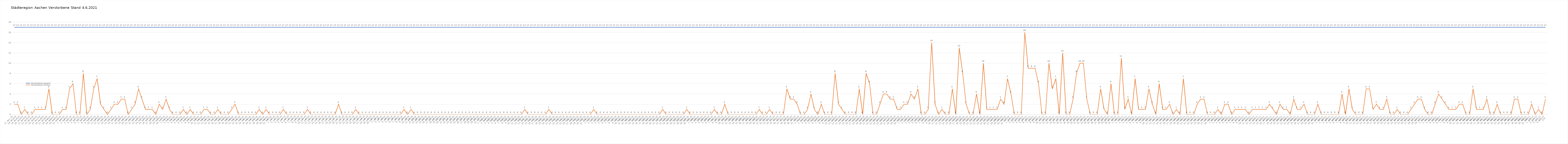
| Category | Verstorbene gesamt | Verstorbene Corona |
|---|---|---|
| 0 | 17 | 2 |
| 1 | 17 | 2 |
| 2 | 17 | 0 |
| 3 | 17 | 1 |
| 4 | 17 | 0 |
| 5 | 17 | 0 |
| 6 | 17 | 1 |
| 7 | 17 | 1 |
| 8 | 17 | 1 |
| 9 | 17 | 1 |
| 10 | 17 | 5 |
| 11 | 17 | 0 |
| 12 | 17 | 0 |
| 13 | 17 | 0 |
| 14 | 17 | 1 |
| 15 | 17 | 1 |
| 16 | 17 | 5 |
| 17 | 17 | 6 |
| 18 | 17 | 0 |
| 19 | 17 | 0 |
| 20 | 17 | 8 |
| 21 | 17 | 0 |
| 22 | 17 | 1 |
| 23 | 17 | 5 |
| 24 | 17 | 7 |
| 25 | 17 | 2 |
| 26 | 17 | 1 |
| 27 | 17 | 0 |
| 28 | 17 | 1 |
| 29 | 17 | 2 |
| 30 | 17 | 2 |
| 31 | 17 | 3 |
| 32 | 17 | 3 |
| 33 | 17 | 0 |
| 34 | 17 | 1 |
| 35 | 17 | 2 |
| 36 | 17 | 5 |
| 37 | 17 | 3 |
| 38 | 17 | 1 |
| 39 | 17 | 1 |
| 40 | 17 | 1 |
| 41 | 17 | 0 |
| 42 | 17 | 2 |
| 43 | 17 | 1 |
| 44 | 17 | 3 |
| 45 | 17 | 1 |
| 46 | 17 | 0 |
| 47 | 17 | 0 |
| 48 | 17 | 0 |
| 49 | 17 | 1 |
| 50 | 17 | 0 |
| 51 | 17 | 1 |
| 52 | 17 | 0 |
| 53 | 17 | 0 |
| 54 | 17 | 0 |
| 55 | 17 | 1 |
| 56 | 17 | 1 |
| 57 | 17 | 0 |
| 58 | 17 | 0 |
| 59 | 17 | 1 |
| 60 | 17 | 0 |
| 61 | 17 | 0 |
| 62 | 17 | 0 |
| 63 | 17 | 1 |
| 64 | 17 | 2 |
| 65 | 17 | 0 |
| 66 | 17 | 0 |
| 67 | 17 | 0 |
| 68 | 17 | 0 |
| 69 | 17 | 0 |
| 70 | 17 | 0 |
| 71 | 17 | 1 |
| 72 | 17 | 0 |
| 73 | 17 | 1 |
| 74 | 17 | 0 |
| 75 | 17 | 0 |
| 76 | 17 | 0 |
| 77 | 17 | 0 |
| 78 | 17 | 1 |
| 79 | 17 | 0 |
| 80 | 17 | 0 |
| 81 | 17 | 0 |
| 82 | 17 | 0 |
| 83 | 17 | 0 |
| 84 | 17 | 0 |
| 85 | 17 | 1 |
| 86 | 17 | 0 |
| 87 | 17 | 0 |
| 88 | 17 | 0 |
| 89 | 17 | 0 |
| 90 | 17 | 0 |
| 91 | 17 | 0 |
| 92 | 17 | 0 |
| 93 | 17 | 0 |
| 94 | 17 | 2 |
| 95 | 17 | 0 |
| 96 | 17 | 0 |
| 97 | 17 | 0 |
| 98 | 17 | 0 |
| 99 | 17 | 1 |
| 100 | 17 | 0 |
| 101 | 17 | 0 |
| 102 | 17 | 0 |
| 103 | 17 | 0 |
| 104 | 17 | 0 |
| 105 | 17 | 0 |
| 106 | 17 | 0 |
| 107 | 17 | 0 |
| 108 | 17 | 0 |
| 109 | 17 | 0 |
| 110 | 17 | 0 |
| 111 | 17 | 0 |
| 112 | 17 | 0 |
| 113 | 17 | 1 |
| 114 | 17 | 0 |
| 115 | 17 | 1 |
| 116 | 17 | 0 |
| 117 | 17 | 0 |
| 118 | 17 | 0 |
| 119 | 17 | 0 |
| 120 | 17 | 0 |
| 121 | 17 | 0 |
| 122 | 17 | 0 |
| 123 | 17 | 0 |
| 124 | 17 | 0 |
| 125 | 17 | 0 |
| 126 | 17 | 0 |
| 127 | 17 | 0 |
| 128 | 17 | 0 |
| 129 | 17 | 0 |
| 130 | 17 | 0 |
| 131 | 17 | 0 |
| 132 | 17 | 0 |
| 133 | 17 | 0 |
| 134 | 17 | 0 |
| 135 | 17 | 0 |
| 136 | 17 | 0 |
| 137 | 17 | 0 |
| 138 | 17 | 0 |
| 139 | 17 | 0 |
| 140 | 17 | 0 |
| 141 | 17 | 0 |
| 142 | 17 | 0 |
| 143 | 17 | 0 |
| 144 | 17 | 0 |
| 145 | 17 | 0 |
| 146 | 17 | 0 |
| 147 | 17 | 0 |
| 148 | 17 | 1 |
| 149 | 17 | 0 |
| 150 | 17 | 0 |
| 151 | 17 | 0 |
| 152 | 17 | 0 |
| 153 | 17 | 0 |
| 154 | 17 | 0 |
| 155 | 17 | 1 |
| 156 | 17 | 0 |
| 157 | 17 | 0 |
| 158 | 17 | 0 |
| 159 | 17 | 0 |
| 160 | 17 | 0 |
| 161 | 17 | 0 |
| 162 | 17 | 0 |
| 163 | 17 | 0 |
| 164 | 17 | 0 |
| 165 | 17 | 0 |
| 166 | 17 | 0 |
| 167 | 17 | 0 |
| 168 | 17 | 1 |
| 169 | 17 | 0 |
| 170 | 17 | 0 |
| 171 | 17 | 0 |
| 172 | 17 | 0 |
| 173 | 17 | 0 |
| 174 | 17 | 0 |
| 175 | 17 | 0 |
| 176 | 17 | 0 |
| 177 | 17 | 0 |
| 178 | 17 | 0 |
| 179 | 17 | 0 |
| 180 | 17 | 0 |
| 181 | 17 | 0 |
| 182 | 17 | 0 |
| 183 | 17 | 0 |
| 184 | 17 | 0 |
| 185 | 17 | 0 |
| 186 | 17 | 0 |
| 187 | 17 | 0 |
| 188 | 17 | 1 |
| 189 | 17 | 0 |
| 190 | 17 | 0 |
| 191 | 17 | 0 |
| 192 | 17 | 0 |
| 193 | 17 | 0 |
| 194 | 17 | 0 |
| 195 | 17 | 1 |
| 196 | 17 | 0 |
| 197 | 17 | 0 |
| 198 | 17 | 0 |
| 199 | 17 | 0 |
| 200 | 17 | 0 |
| 201 | 17 | 0 |
| 202 | 17 | 0 |
| 203 | 17 | 1 |
| 204 | 17 | 0 |
| 205 | 17 | 0 |
| 206 | 17 | 2 |
| 207 | 17 | 0 |
| 208 | 17 | 0 |
| 209 | 17 | 0 |
| 210 | 17 | 0 |
| 211 | 17 | 0 |
| 212 | 17 | 0 |
| 213 | 17 | 0 |
| 214 | 17 | 0 |
| 215 | 17 | 0 |
| 216 | 17 | 1 |
| 217 | 17 | 0 |
| 218 | 17 | 0 |
| 219 | 17 | 1 |
| 220 | 17 | 0 |
| 221 | 17 | 0 |
| 222 | 17 | 0 |
| 223 | 17 | 0 |
| 224 | 17 | 5 |
| 225 | 17 | 3 |
| 226 | 17 | 3 |
| 227 | 17 | 2 |
| 228 | 17 | 0 |
| 229 | 17 | 0 |
| 230 | 17 | 1 |
| 231 | 17 | 4 |
| 232 | 17 | 1 |
| 233 | 17 | 0 |
| 234 | 17 | 2 |
| 235 | 17 | 0 |
| 236 | 17 | 0 |
| 237 | 17 | 0 |
| 238 | 17 | 8 |
| 239 | 17 | 2 |
| 240 | 17 | 1 |
| 241 | 17 | 0 |
| 242 | 17 | 0 |
| 243 | 17 | 0 |
| 244 | 17 | 0 |
| 245 | 17 | 5 |
| 246 | 17 | 0 |
| 247 | 17 | 8 |
| 248 | 17 | 6 |
| 249 | 17 | 0 |
| 250 | 17 | 0 |
| 251 | 17 | 2 |
| 252 | 17 | 4 |
| 253 | 17 | 4 |
| 254 | 17 | 3 |
| 255 | 17 | 3 |
| 256 | 17 | 1 |
| 257 | 17 | 1 |
| 258 | 17 | 2 |
| 259 | 17 | 2 |
| 260 | 17 | 4 |
| 261 | 17 | 3 |
| 262 | 17 | 5 |
| 263 | 17 | 0 |
| 264 | 17 | 0 |
| 265 | 17 | 1 |
| 266 | 17 | 14 |
| 267 | 17 | 2 |
| 268 | 17 | 0 |
| 269 | 17 | 1 |
| 270 | 17 | 0 |
| 271 | 17 | 0 |
| 272 | 17 | 5 |
| 273 | 17 | 0 |
| 274 | 17 | 13 |
| 275 | 17 | 8 |
| 276 | 17 | 2 |
| 277 | 17 | 0 |
| 278 | 17 | 0 |
| 279 | 17 | 4 |
| 280 | 17 | 0 |
| 281 | 17 | 10 |
| 282 | 17 | 1 |
| 283 | 17 | 1 |
| 284 | 17 | 1 |
| 285 | 17 | 1 |
| 286 | 17 | 3 |
| 287 | 17 | 2 |
| 288 | 17 | 7 |
| 289 | 17 | 4 |
| 290 | 17 | 0 |
| 291 | 17 | 0 |
| 292 | 17 | 0 |
| 293 | 17 | 16 |
| 294 | 17 | 9 |
| 295 | 17 | 9 |
| 296 | 17 | 9 |
| 297 | 17 | 6 |
| 298 | 17 | 0 |
| 299 | 17 | 0 |
| 300 | 17 | 10 |
| 301 | 17 | 5 |
| 302 | 17 | 7 |
| 303 | 17 | 0 |
| 304 | 17 | 12 |
| 305 | 17 | 0 |
| 306 | 17 | 0 |
| 307 | 17 | 3 |
| 308 | 17 | 8 |
| 309 | 17 | 10 |
| 310 | 17 | 10 |
| 311 | 17 | 3 |
| 312 | 17 | 0 |
| 313 | 17 | 0 |
| 314 | 17 | 0 |
| 315 | 17 | 5 |
| 316 | 17 | 1 |
| 317 | 17 | 0 |
| 318 | 17 | 6 |
| 319 | 17 | 0 |
| 320 | 17 | 0 |
| 321 | 17 | 11 |
| 322 | 17 | 1 |
| 323 | 17 | 3 |
| 324 | 17 | 0 |
| 325 | 17 | 7 |
| 326 | 17 | 1 |
| 327 | 17 | 1 |
| 328 | 17 | 1 |
| 329 | 17 | 5 |
| 330 | 17 | 2 |
| 331 | 17 | 0 |
| 332 | 17 | 6 |
| 333 | 17 | 1 |
| 334 | 17 | 1 |
| 335 | 17 | 2 |
| 336 | 17 | 0 |
| 337 | 17 | 1 |
| 338 | 17 | 0 |
| 339 | 17 | 7 |
| 340 | 17 | 0 |
| 341 | 17 | 0 |
| 342 | 17 | 0 |
| 343 | 17 | 2 |
| 344 | 17 | 3 |
| 345 | 17 | 3 |
| 346 | 17 | 0 |
| 347 | 17 | 0 |
| 348 | 17 | 0 |
| 349 | 17 | 1 |
| 350 | 17 | 0 |
| 351 | 17 | 2 |
| 352 | 17 | 2 |
| 353 | 17 | 0 |
| 354 | 17 | 1 |
| 355 | 17 | 1 |
| 356 | 17 | 1 |
| 357 | 17 | 1 |
| 358 | 17 | 0 |
| 359 | 17 | 1 |
| 360 | 17 | 1 |
| 361 | 17 | 1 |
| 362 | 17 | 1 |
| 363 | 17 | 1 |
| 364 | 17 | 2 |
| 365 | 17 | 1 |
| 366 | 17 | 0 |
| 367 | 17 | 2 |
| 368 | 17 | 1 |
| 369 | 17 | 1 |
| 370 | 17 | 0 |
| 371 | 17 | 3 |
| 372 | 17 | 1 |
| 373 | 17 | 1 |
| 374 | 17 | 2 |
| 375 | 17 | 0 |
| 376 | 17 | 0 |
| 377 | 17 | 0 |
| 378 | 17 | 2 |
| 379 | 17 | 0 |
| 380 | 17 | 0 |
| 381 | 17 | 0 |
| 382 | 17 | 0 |
| 383 | 17 | 0 |
| 384 | 17 | 0 |
| 385 | 17 | 4 |
| 386 | 17 | 0 |
| 387 | 17 | 5 |
| 388 | 17 | 1 |
| 389 | 17 | 0 |
| 390 | 17 | 0 |
| 391 | 17 | 0 |
| 392 | 17 | 5 |
| 393 | 17 | 5 |
| 394 | 17 | 1 |
| 395 | 17 | 2 |
| 396 | 17 | 1 |
| 397 | 17 | 1 |
| 398 | 17 | 3 |
| 399 | 17 | 0 |
| 400 | 17 | 0 |
| 401 | 17 | 1 |
| 402 | 17 | 0 |
| 403 | 17 | 0 |
| 404 | 17 | 0 |
| 405 | 17 | 1 |
| 406 | 17 | 2 |
| 407 | 17 | 3 |
| 408 | 17 | 3 |
| 409 | 17 | 1 |
| 410 | 17 | 0 |
| 411 | 17 | 0 |
| 412 | 17 | 2 |
| 413 | 17 | 4 |
| 414 | 17 | 3 |
| 415 | 17 | 2 |
| 416 | 17 | 1 |
| 417 | 17 | 1 |
| 418 | 17 | 1 |
| 419 | 17 | 2 |
| 420 | 17 | 2 |
| 421 | 17 | 0 |
| 422 | 17 | 0 |
| 423 | 17 | 5 |
| 424 | 17 | 1 |
| 425 | 17 | 1 |
| 426 | 17 | 1 |
| 427 | 17 | 3 |
| 428 | 17 | 0 |
| 429 | 17 | 0 |
| 430 | 17 | 2 |
| 431 | 17 | 0 |
| 432 | 17 | 0 |
| 433 | 17 | 0 |
| 434 | 17 | 0 |
| 435 | 17 | 3 |
| 436 | 17 | 3 |
| 437 | 17 | 0 |
| 438 | 17 | 0 |
| 439 | 17 | 0 |
| 440 | 17 | 2 |
| 441 | 17 | 0 |
| 442 | 17 | 1 |
| 443 | 17 | 0 |
| 444 | 17 | 3 |